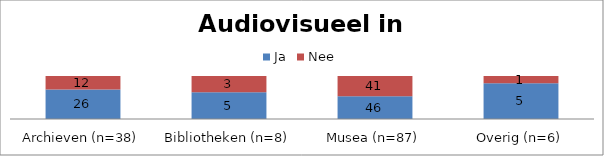
| Category | Ja | Nee |
|---|---|---|
| Archieven (n=38) | 26 | 12 |
| Bibliotheken (n=8) | 5 | 3 |
| Musea (n=87) | 46 | 41 |
| Overig (n=6) | 5 | 1 |